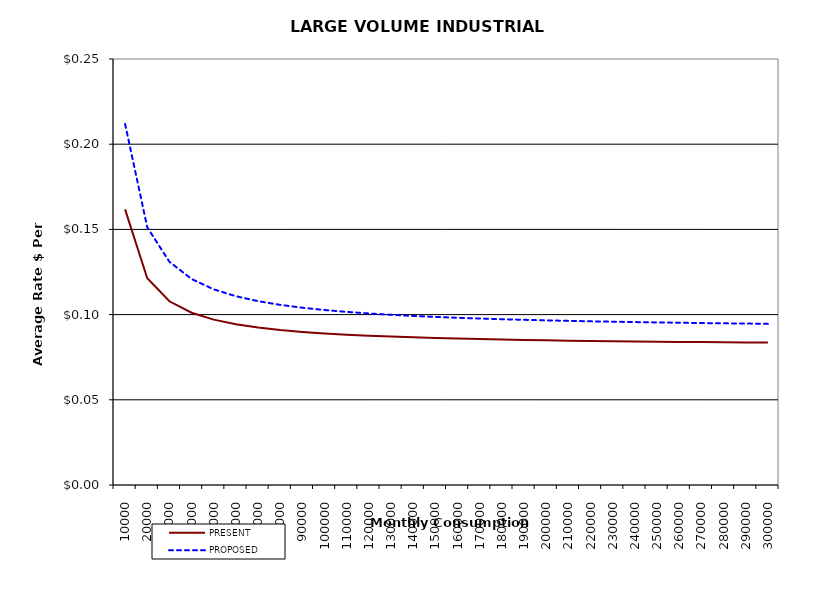
| Category | PRESENT | PROPOSED |
|---|---|---|
| 10000.0 | 0.162 | 0.212 |
| 20000.0 | 0.121 | 0.151 |
| 30000.0 | 0.108 | 0.131 |
| 40000.0 | 0.101 | 0.121 |
| 50000.0 | 0.097 | 0.115 |
| 60000.0 | 0.094 | 0.111 |
| 70000.0 | 0.092 | 0.108 |
| 80000.0 | 0.091 | 0.106 |
| 90000.0 | 0.09 | 0.104 |
| 100000.0 | 0.089 | 0.103 |
| 110000.0 | 0.088 | 0.102 |
| 120000.0 | 0.088 | 0.101 |
| 130000.0 | 0.087 | 0.1 |
| 140000.0 | 0.087 | 0.099 |
| 150000.0 | 0.086 | 0.099 |
| 160000.0 | 0.086 | 0.098 |
| 170000.0 | 0.086 | 0.098 |
| 180000.0 | 0.085 | 0.097 |
| 190000.0 | 0.085 | 0.097 |
| 200000.0 | 0.085 | 0.097 |
| 210000.0 | 0.085 | 0.096 |
| 220000.0 | 0.085 | 0.096 |
| 230000.0 | 0.084 | 0.096 |
| 240000.0 | 0.084 | 0.096 |
| 250000.0 | 0.084 | 0.095 |
| 260000.0 | 0.084 | 0.095 |
| 270000.0 | 0.084 | 0.095 |
| 280000.0 | 0.084 | 0.095 |
| 290000.0 | 0.084 | 0.095 |
| 300000.0 | 0.084 | 0.095 |